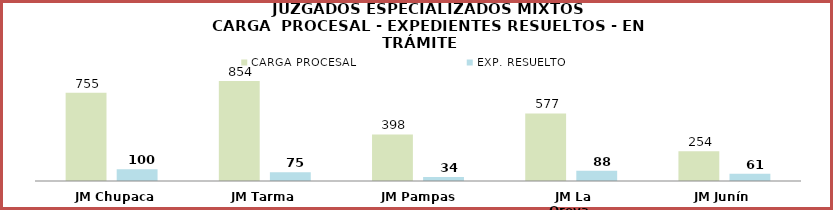
| Category | CARGA PROCESAL | EXP. RESUELTO |
|---|---|---|
| JM Chupaca | 755 | 100 |
| JM Tarma | 854 | 75 |
| JM Pampas | 398 | 34 |
| JM La Oroya | 577 | 88 |
| JM Junín | 254 | 61 |